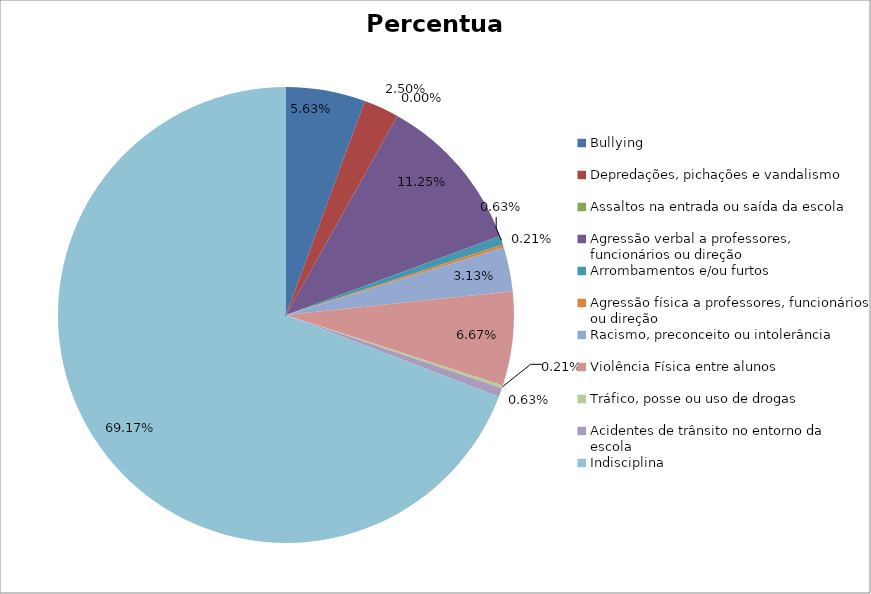
| Category | Percentual |
|---|---|
| Bullying | 0.056 |
| Depredações, pichações e vandalismo | 0.025 |
| Assaltos na entrada ou saída da escola | 0 |
| Agressão verbal a professores, funcionários ou direção | 0.112 |
| Arrombamentos e/ou furtos | 0.006 |
| Agressão física a professores, funcionários ou direção | 0.002 |
| Racismo, preconceito ou intolerância | 0.031 |
| Violência Física entre alunos | 0.067 |
| Tráfico, posse ou uso de drogas | 0.002 |
| Acidentes de trânsito no entorno da escola | 0.006 |
| Indisciplina | 0.692 |